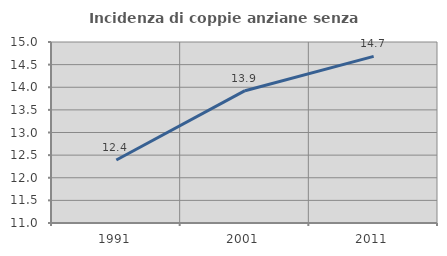
| Category | Incidenza di coppie anziane senza figli  |
|---|---|
| 1991.0 | 12.393 |
| 2001.0 | 13.924 |
| 2011.0 | 14.683 |